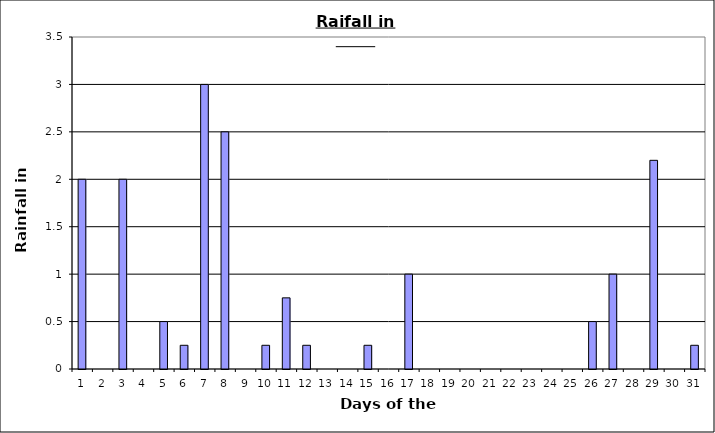
| Category | Series 0 |
|---|---|
| 0 | 2 |
| 1 | 0 |
| 2 | 2 |
| 3 | 0 |
| 4 | 0.5 |
| 5 | 0.25 |
| 6 | 3 |
| 7 | 2.5 |
| 8 | 0 |
| 9 | 0.25 |
| 10 | 0.75 |
| 11 | 0.25 |
| 12 | 0 |
| 13 | 0 |
| 14 | 0.25 |
| 15 | 0 |
| 16 | 1 |
| 17 | 0 |
| 18 | 0 |
| 19 | 0 |
| 20 | 0 |
| 21 | 0 |
| 22 | 0 |
| 23 | 0 |
| 24 | 0 |
| 25 | 0.5 |
| 26 | 1 |
| 27 | 0 |
| 28 | 2.2 |
| 29 | 0 |
| 30 | 0.25 |